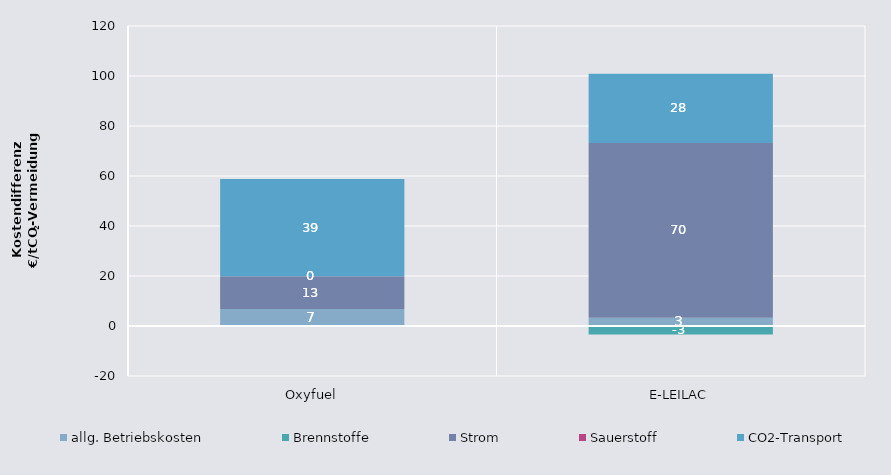
| Category | allg. Betriebskosten | Brennstoffe | Strom | Sauerstoff | CO2-Transport |
|---|---|---|---|---|---|
| Oxyfuel | 6.817 | 0 | 13.082 | 0 | 38.91 |
| E-LEILAC | 3.276 | -3.37 | 69.887 | 0 | 27.775 |